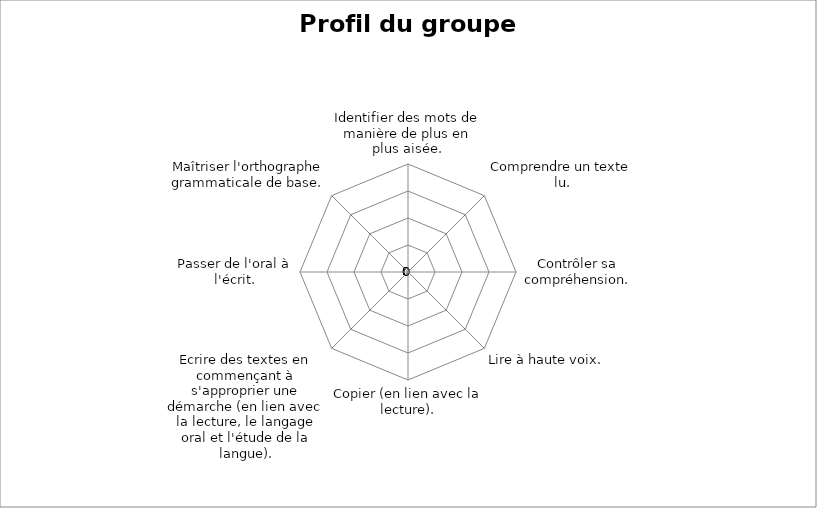
| Category | PréTest | PostTest |
|---|---|---|
| Identifier des mots de manière de plus en plus aisée. | 0 | 0 |
| Comprendre un texte lu. | 0 | 0 |
| Contrôler sa compréhension. | 0 | 0 |
| Lire à haute voix. | 0 | 0 |
| Copier (en lien avec la lecture). | 0 | 0 |
| Ecrire des textes en commençant à s'approprier une démarche (en lien avec la lecture, le langage oral et l'étude de la langue). | 0 | 0 |
| Passer de l'oral à l'écrit. | 0 | 0 |
| Maîtriser l'orthographe grammaticale de base. | 0 | 0 |